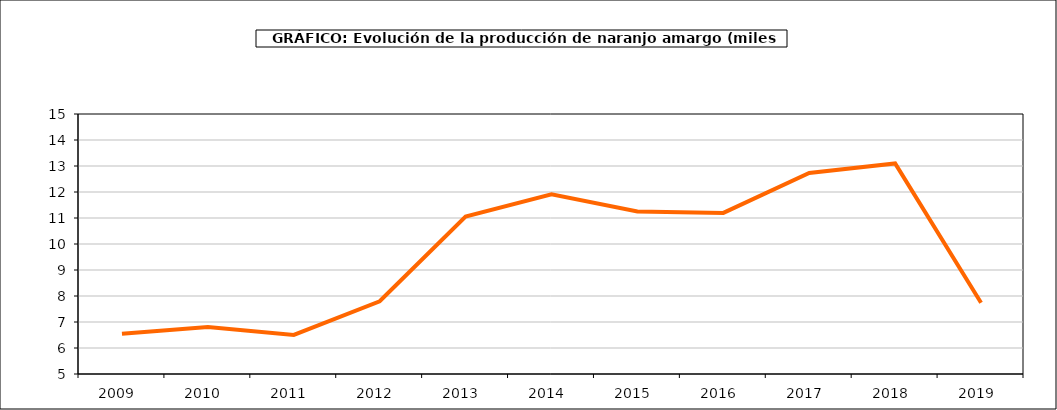
| Category | producción |
|---|---|
| 2009.0 | 6.545 |
| 2010.0 | 6.81 |
| 2011.0 | 6.501 |
| 2012.0 | 7.798 |
| 2013.0 | 11.051 |
| 2014.0 | 11.915 |
| 2015.0 | 11.247 |
| 2016.0 | 11.197 |
| 2017.0 | 12.735 |
| 2018.0 | 13.1 |
| 2019.0 | 7.74 |